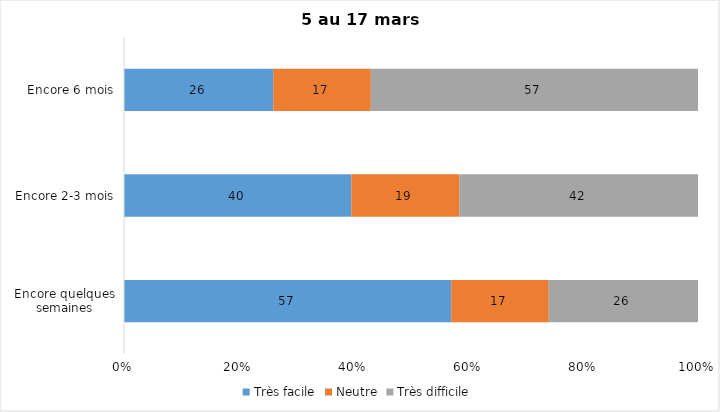
| Category | Très facile | Neutre | Très difficile |
|---|---|---|---|
| Encore quelques semaines | 57 | 17 | 26 |
| Encore 2-3 mois | 40 | 19 | 42 |
| Encore 6 mois | 26 | 17 | 57 |